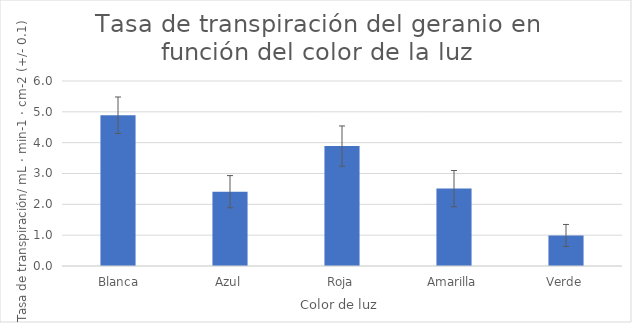
| Category | Series 0 |
|---|---|
|  Blanca | 4.89 |
| Azul | 2.41 |
| Roja | 3.89 |
| Amarilla | 2.51 |
| Verde | 0.99 |